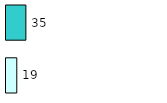
| Category | Series 0 | Series 1 |
|---|---|---|
| 0 | 19 | 35 |